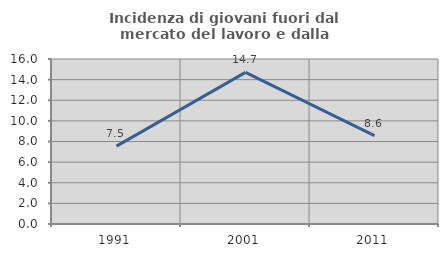
| Category | Incidenza di giovani fuori dal mercato del lavoro e dalla formazione  |
|---|---|
| 1991.0 | 7.547 |
| 2001.0 | 14.706 |
| 2011.0 | 8.571 |